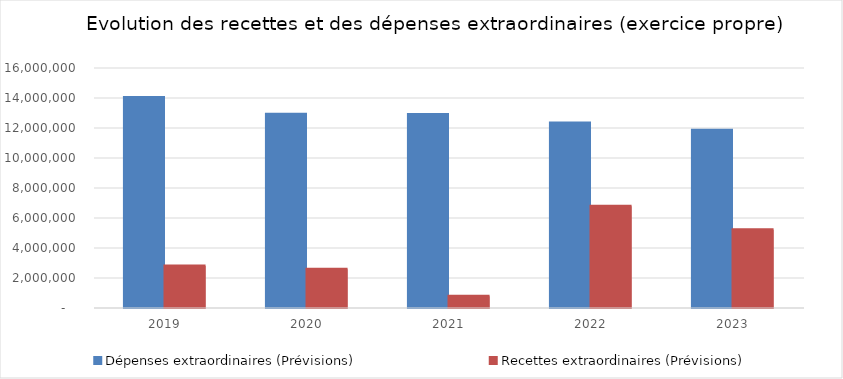
| Category | Dépenses extraordinaires (Prévisions) | Recettes extraordinaires (Prévisions) |
|---|---|---|
| 2019.0 | 14031213.94 | 2800530.96 |
| 2020.0 | 12916552.7 | 2583800 |
| 2021.0 | 12903052.7 | 789500 |
| 2022.0 | 12334052.7 | 6790500 |
| 2023.0 | 11848495.86 | 5209007.11 |